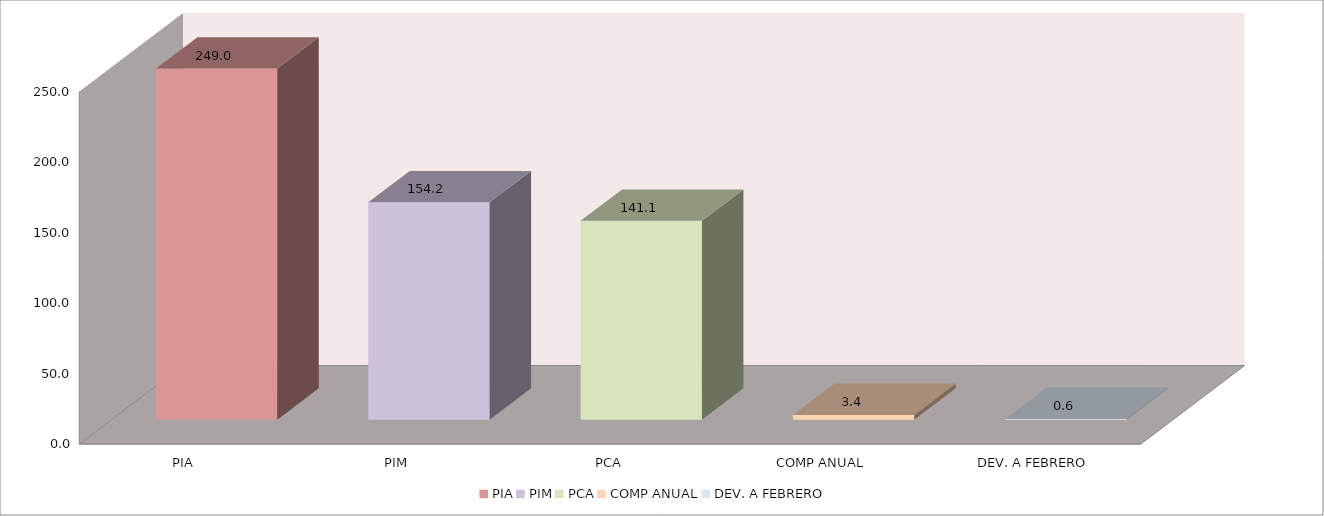
| Category | 011 MINISTERIO DE SALUD |
|---|---|
| PIA | 249.028 |
| PIM | 154.194 |
| PCA | 141.055 |
| COMP ANUAL | 3.352 |
| DEV. A FEBRERO | 0.574 |